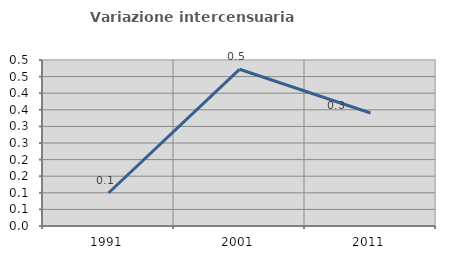
| Category | Variazione intercensuaria annua |
|---|---|
| 1991.0 | 0.099 |
| 2001.0 | 0.472 |
| 2011.0 | 0.34 |